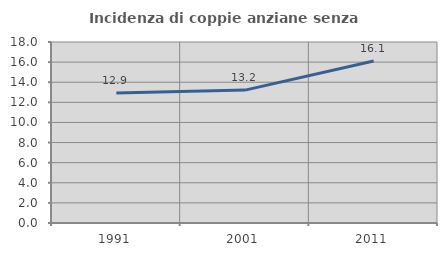
| Category | Incidenza di coppie anziane senza figli  |
|---|---|
| 1991.0 | 12.931 |
| 2001.0 | 13.216 |
| 2011.0 | 16.118 |